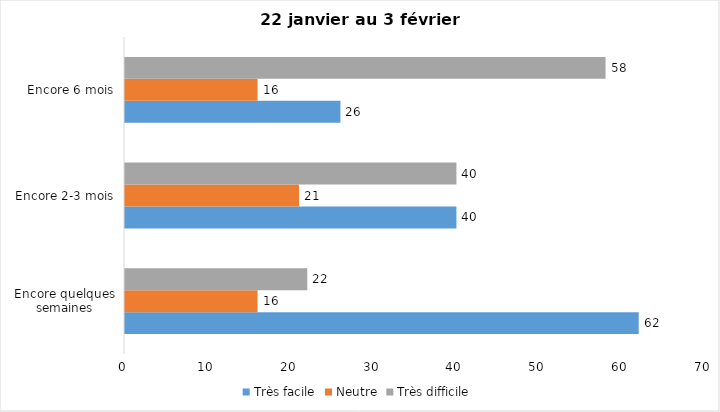
| Category | Très facile | Neutre | Très difficile |
|---|---|---|---|
| Encore quelques semaines | 62 | 16 | 22 |
| Encore 2-3 mois | 40 | 21 | 40 |
| Encore 6 mois | 26 | 16 | 58 |